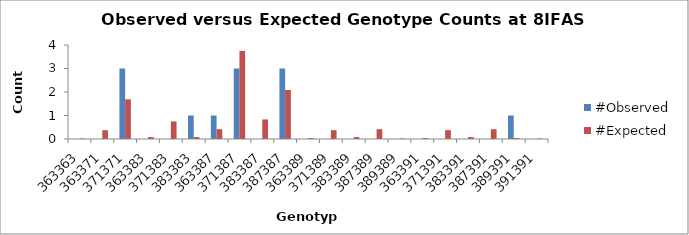
| Category | #Observed | #Expected |
|---|---|---|
| 363363.0 | 0 | 0.021 |
| 363371.0 | 0 | 0.375 |
| 371371.0 | 3 | 1.688 |
| 363383.0 | 0 | 0.083 |
| 371383.0 | 0 | 0.75 |
| 383383.0 | 1 | 0.083 |
| 363387.0 | 1 | 0.417 |
| 371387.0 | 3 | 3.75 |
| 383387.0 | 0 | 0.833 |
| 387387.0 | 3 | 2.083 |
| 363389.0 | 0 | 0.042 |
| 371389.0 | 0 | 0.375 |
| 383389.0 | 0 | 0.083 |
| 387389.0 | 0 | 0.417 |
| 389389.0 | 0 | 0.021 |
| 363391.0 | 0 | 0.042 |
| 371391.0 | 0 | 0.375 |
| 383391.0 | 0 | 0.083 |
| 387391.0 | 0 | 0.417 |
| 389391.0 | 1 | 0.042 |
| 391391.0 | 0 | 0.021 |